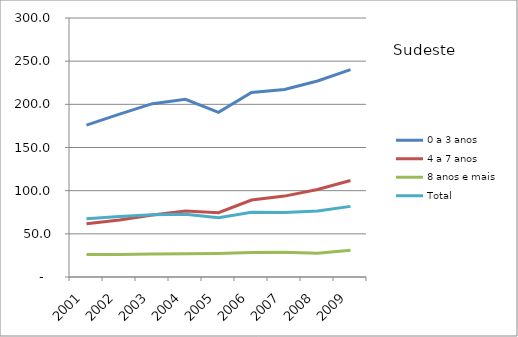
| Category | 0 a 3 anos | 4 a 7 anos | 8 anos e mais | Total |
|---|---|---|---|---|
| 2001.0 | 175.9 | 61.6 | 26.1 | 67.6 |
| 2002.0 | 188.6 | 66 | 26.2 | 70.1 |
| 2003.0 | 200.8 | 71.7 | 26.5 | 72.2 |
| 2004.0 | 205.8 | 76.5 | 26.8 | 72.8 |
| 2005.0 | 190.7 | 74.4 | 27.2 | 68.6 |
| 2006.0 | 213.7 | 89.2 | 28.3 | 74.9 |
| 2007.0 | 217.2 | 93.7 | 28.6 | 74.7 |
| 2008.0 | 227 | 101.4 | 27.6 | 76.5 |
| 2009.0 | 240.2 | 111.7 | 30.9 | 81.8 |